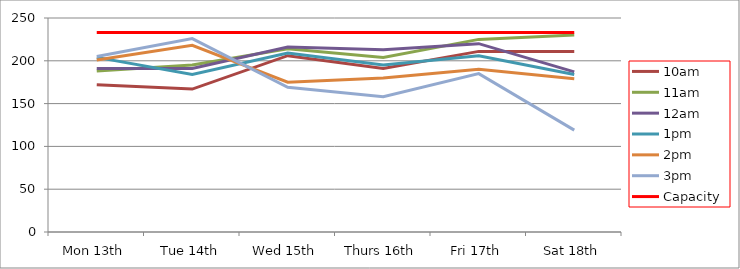
| Category | 9am | 10am | 11am | 12am | 1pm | 2pm | 3pm | 4pm | 5pm | Capacity |
|---|---|---|---|---|---|---|---|---|---|---|
| Mon 13th |  | 172 | 188 | 191 | 204 | 201 | 205 |  |  | 233 |
| Tue 14th |  | 167 | 195 | 191 | 184 | 218 | 226 |  |  | 233 |
| Wed 15th |  | 206 | 214 | 216 | 209 | 175 | 169 |  |  | 233 |
| Thurs 16th |  | 191 | 204 | 213 | 195 | 180 | 158 |  |  | 233 |
| Fri 17th |  | 211 | 225 | 220 | 206 | 190 | 185 |  |  | 233 |
| Sat 18th |  | 211 | 230 | 187 | 184 | 179 | 119 |  |  | 233 |